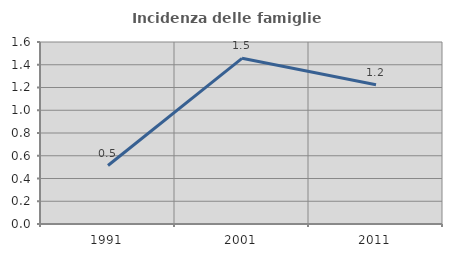
| Category | Incidenza delle famiglie numerose |
|---|---|
| 1991.0 | 0.514 |
| 2001.0 | 1.456 |
| 2011.0 | 1.224 |